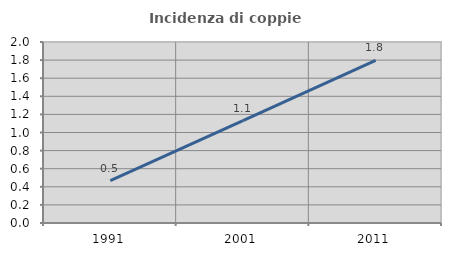
| Category | Incidenza di coppie miste |
|---|---|
| 1991.0 | 0.469 |
| 2001.0 | 1.13 |
| 2011.0 | 1.798 |